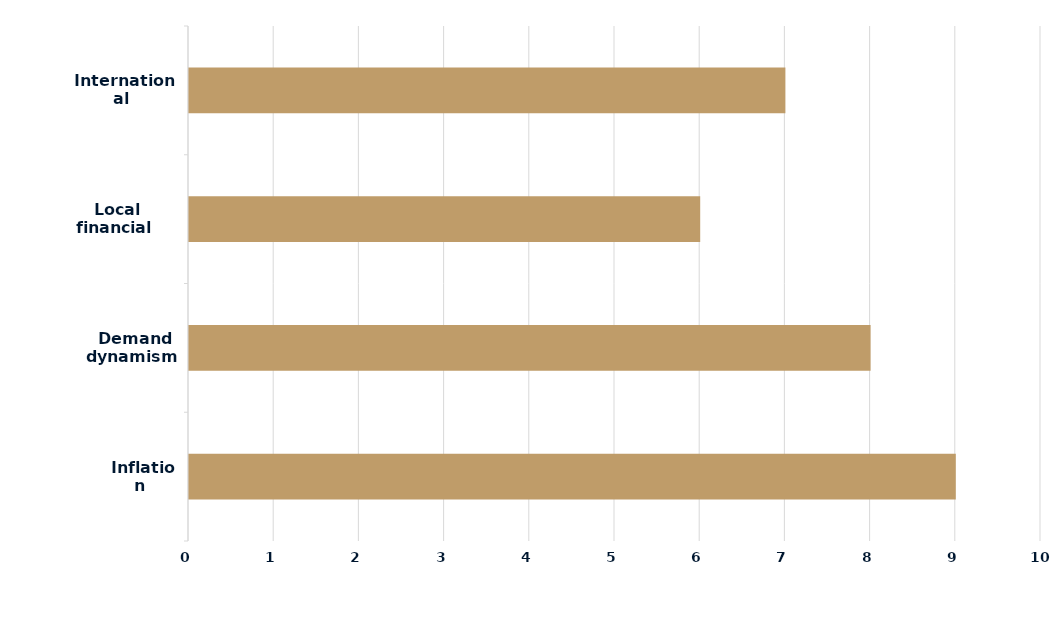
| Category | Series 0 |
|---|---|
|  Inflation | 9 |
|  Demand dynamism | 8 |
|  Local financial conditions | 6 |
|  International environment | 7 |